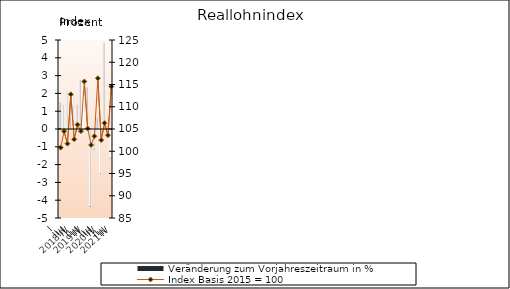
| Category | Veränderung zum Vorjahreszeitraum in % |
|---|---|
| 0 | 1.5 |
| 1 | 1.3 |
| 2 | 2.1 |
| 3 | 1.5 |
| 4 | 1.903 |
| 5 | 1.377 |
| 6 | 2.751 |
| 7 | 2.55 |
| 8 | 2.343 |
| 9 | -4.307 |
| 10 | -1.089 |
| 11 | 0.626 |
| 12 | -2.464 |
| 13 | 4.849 |
| 14 | 0.225 |
| 15 | -1.585 |